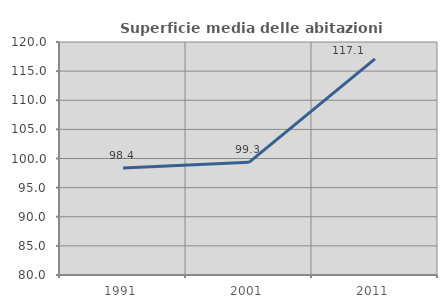
| Category | Superficie media delle abitazioni occupate |
|---|---|
| 1991.0 | 98.375 |
| 2001.0 | 99.34 |
| 2011.0 | 117.101 |